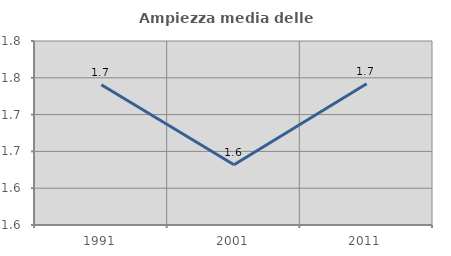
| Category | Ampiezza media delle famiglie |
|---|---|
| 1991.0 | 1.74 |
| 2001.0 | 1.632 |
| 2011.0 | 1.742 |